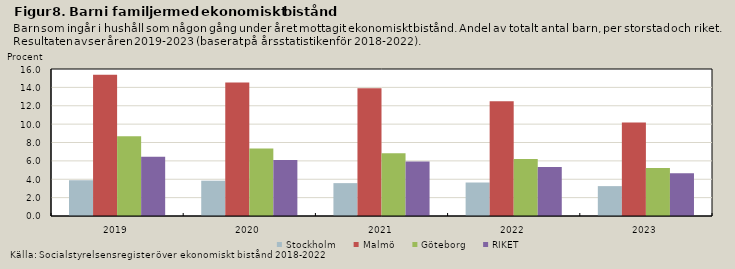
| Category | Stockholm | Malmö | Göteborg | RIKET |
|---|---|---|---|---|
| 2019.0 | 3.893 | 15.382 | 8.689 | 6.439 |
| 2020.0 | 3.843 | 14.523 | 7.348 | 6.092 |
| 2021.0 | 3.579 | 13.892 | 6.827 | 5.941 |
| 2022.0 | 3.645 | 12.5 | 6.202 | 5.333 |
| 2023.0 | 3.252 | 10.188 | 5.219 | 4.646 |